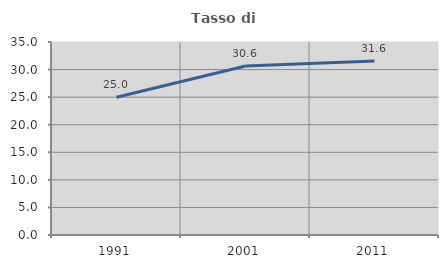
| Category | Tasso di occupazione   |
|---|---|
| 1991.0 | 24.966 |
| 2001.0 | 30.649 |
| 2011.0 | 31.564 |